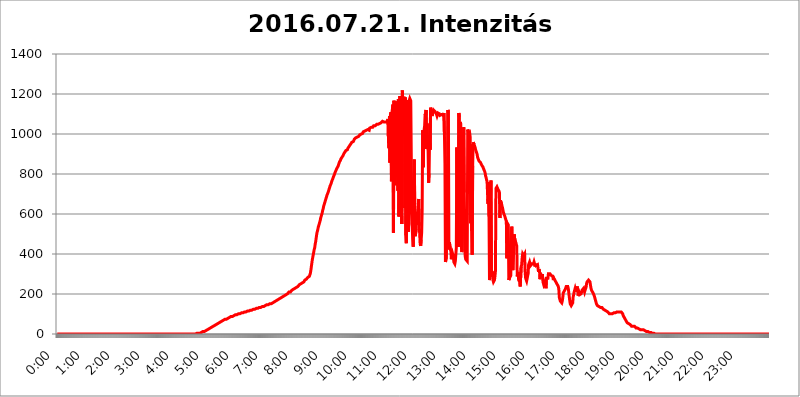
| Category | 2016.07.21. Intenzitás [W/m^2] |
|---|---|
| 0.0 | 0 |
| 0.0006944444444444445 | 0 |
| 0.001388888888888889 | 0 |
| 0.0020833333333333333 | 0 |
| 0.002777777777777778 | 0 |
| 0.003472222222222222 | 0 |
| 0.004166666666666667 | 0 |
| 0.004861111111111111 | 0 |
| 0.005555555555555556 | 0 |
| 0.0062499999999999995 | 0 |
| 0.006944444444444444 | 0 |
| 0.007638888888888889 | 0 |
| 0.008333333333333333 | 0 |
| 0.009027777777777779 | 0 |
| 0.009722222222222222 | 0 |
| 0.010416666666666666 | 0 |
| 0.011111111111111112 | 0 |
| 0.011805555555555555 | 0 |
| 0.012499999999999999 | 0 |
| 0.013194444444444444 | 0 |
| 0.013888888888888888 | 0 |
| 0.014583333333333332 | 0 |
| 0.015277777777777777 | 0 |
| 0.015972222222222224 | 0 |
| 0.016666666666666666 | 0 |
| 0.017361111111111112 | 0 |
| 0.018055555555555557 | 0 |
| 0.01875 | 0 |
| 0.019444444444444445 | 0 |
| 0.02013888888888889 | 0 |
| 0.020833333333333332 | 0 |
| 0.02152777777777778 | 0 |
| 0.022222222222222223 | 0 |
| 0.02291666666666667 | 0 |
| 0.02361111111111111 | 0 |
| 0.024305555555555556 | 0 |
| 0.024999999999999998 | 0 |
| 0.025694444444444447 | 0 |
| 0.02638888888888889 | 0 |
| 0.027083333333333334 | 0 |
| 0.027777777777777776 | 0 |
| 0.02847222222222222 | 0 |
| 0.029166666666666664 | 0 |
| 0.029861111111111113 | 0 |
| 0.030555555555555555 | 0 |
| 0.03125 | 0 |
| 0.03194444444444445 | 0 |
| 0.03263888888888889 | 0 |
| 0.03333333333333333 | 0 |
| 0.034027777777777775 | 0 |
| 0.034722222222222224 | 0 |
| 0.035416666666666666 | 0 |
| 0.036111111111111115 | 0 |
| 0.03680555555555556 | 0 |
| 0.0375 | 0 |
| 0.03819444444444444 | 0 |
| 0.03888888888888889 | 0 |
| 0.03958333333333333 | 0 |
| 0.04027777777777778 | 0 |
| 0.04097222222222222 | 0 |
| 0.041666666666666664 | 0 |
| 0.042361111111111106 | 0 |
| 0.04305555555555556 | 0 |
| 0.043750000000000004 | 0 |
| 0.044444444444444446 | 0 |
| 0.04513888888888889 | 0 |
| 0.04583333333333334 | 0 |
| 0.04652777777777778 | 0 |
| 0.04722222222222222 | 0 |
| 0.04791666666666666 | 0 |
| 0.04861111111111111 | 0 |
| 0.049305555555555554 | 0 |
| 0.049999999999999996 | 0 |
| 0.05069444444444445 | 0 |
| 0.051388888888888894 | 0 |
| 0.052083333333333336 | 0 |
| 0.05277777777777778 | 0 |
| 0.05347222222222222 | 0 |
| 0.05416666666666667 | 0 |
| 0.05486111111111111 | 0 |
| 0.05555555555555555 | 0 |
| 0.05625 | 0 |
| 0.05694444444444444 | 0 |
| 0.057638888888888885 | 0 |
| 0.05833333333333333 | 0 |
| 0.05902777777777778 | 0 |
| 0.059722222222222225 | 0 |
| 0.06041666666666667 | 0 |
| 0.061111111111111116 | 0 |
| 0.06180555555555556 | 0 |
| 0.0625 | 0 |
| 0.06319444444444444 | 0 |
| 0.06388888888888888 | 0 |
| 0.06458333333333334 | 0 |
| 0.06527777777777778 | 0 |
| 0.06597222222222222 | 0 |
| 0.06666666666666667 | 0 |
| 0.06736111111111111 | 0 |
| 0.06805555555555555 | 0 |
| 0.06874999999999999 | 0 |
| 0.06944444444444443 | 0 |
| 0.07013888888888889 | 0 |
| 0.07083333333333333 | 0 |
| 0.07152777777777779 | 0 |
| 0.07222222222222223 | 0 |
| 0.07291666666666667 | 0 |
| 0.07361111111111111 | 0 |
| 0.07430555555555556 | 0 |
| 0.075 | 0 |
| 0.07569444444444444 | 0 |
| 0.0763888888888889 | 0 |
| 0.07708333333333334 | 0 |
| 0.07777777777777778 | 0 |
| 0.07847222222222222 | 0 |
| 0.07916666666666666 | 0 |
| 0.0798611111111111 | 0 |
| 0.08055555555555556 | 0 |
| 0.08125 | 0 |
| 0.08194444444444444 | 0 |
| 0.08263888888888889 | 0 |
| 0.08333333333333333 | 0 |
| 0.08402777777777777 | 0 |
| 0.08472222222222221 | 0 |
| 0.08541666666666665 | 0 |
| 0.08611111111111112 | 0 |
| 0.08680555555555557 | 0 |
| 0.08750000000000001 | 0 |
| 0.08819444444444445 | 0 |
| 0.08888888888888889 | 0 |
| 0.08958333333333333 | 0 |
| 0.09027777777777778 | 0 |
| 0.09097222222222222 | 0 |
| 0.09166666666666667 | 0 |
| 0.09236111111111112 | 0 |
| 0.09305555555555556 | 0 |
| 0.09375 | 0 |
| 0.09444444444444444 | 0 |
| 0.09513888888888888 | 0 |
| 0.09583333333333333 | 0 |
| 0.09652777777777777 | 0 |
| 0.09722222222222222 | 0 |
| 0.09791666666666667 | 0 |
| 0.09861111111111111 | 0 |
| 0.09930555555555555 | 0 |
| 0.09999999999999999 | 0 |
| 0.10069444444444443 | 0 |
| 0.1013888888888889 | 0 |
| 0.10208333333333335 | 0 |
| 0.10277777777777779 | 0 |
| 0.10347222222222223 | 0 |
| 0.10416666666666667 | 0 |
| 0.10486111111111111 | 0 |
| 0.10555555555555556 | 0 |
| 0.10625 | 0 |
| 0.10694444444444444 | 0 |
| 0.1076388888888889 | 0 |
| 0.10833333333333334 | 0 |
| 0.10902777777777778 | 0 |
| 0.10972222222222222 | 0 |
| 0.1111111111111111 | 0 |
| 0.11180555555555556 | 0 |
| 0.11180555555555556 | 0 |
| 0.1125 | 0 |
| 0.11319444444444444 | 0 |
| 0.11388888888888889 | 0 |
| 0.11458333333333333 | 0 |
| 0.11527777777777777 | 0 |
| 0.11597222222222221 | 0 |
| 0.11666666666666665 | 0 |
| 0.1173611111111111 | 0 |
| 0.11805555555555557 | 0 |
| 0.11944444444444445 | 0 |
| 0.12013888888888889 | 0 |
| 0.12083333333333333 | 0 |
| 0.12152777777777778 | 0 |
| 0.12222222222222223 | 0 |
| 0.12291666666666667 | 0 |
| 0.12291666666666667 | 0 |
| 0.12361111111111112 | 0 |
| 0.12430555555555556 | 0 |
| 0.125 | 0 |
| 0.12569444444444444 | 0 |
| 0.12638888888888888 | 0 |
| 0.12708333333333333 | 0 |
| 0.16875 | 0 |
| 0.12847222222222224 | 0 |
| 0.12916666666666668 | 0 |
| 0.12986111111111112 | 0 |
| 0.13055555555555556 | 0 |
| 0.13125 | 0 |
| 0.13194444444444445 | 0 |
| 0.1326388888888889 | 0 |
| 0.13333333333333333 | 0 |
| 0.13402777777777777 | 0 |
| 0.13402777777777777 | 0 |
| 0.13472222222222222 | 0 |
| 0.13541666666666666 | 0 |
| 0.1361111111111111 | 0 |
| 0.13749999999999998 | 0 |
| 0.13819444444444443 | 0 |
| 0.1388888888888889 | 0 |
| 0.13958333333333334 | 0 |
| 0.14027777777777778 | 0 |
| 0.14097222222222222 | 0 |
| 0.14166666666666666 | 0 |
| 0.1423611111111111 | 0 |
| 0.14305555555555557 | 0 |
| 0.14375000000000002 | 0 |
| 0.14444444444444446 | 0 |
| 0.1451388888888889 | 0 |
| 0.1451388888888889 | 0 |
| 0.14652777777777778 | 0 |
| 0.14722222222222223 | 0 |
| 0.14791666666666667 | 0 |
| 0.1486111111111111 | 0 |
| 0.14930555555555555 | 0 |
| 0.15 | 0 |
| 0.15069444444444444 | 0 |
| 0.15138888888888888 | 0 |
| 0.15208333333333332 | 0 |
| 0.15277777777777776 | 0 |
| 0.15347222222222223 | 0 |
| 0.15416666666666667 | 0 |
| 0.15486111111111112 | 0 |
| 0.15555555555555556 | 0 |
| 0.15625 | 0 |
| 0.15694444444444444 | 0 |
| 0.15763888888888888 | 0 |
| 0.15833333333333333 | 0 |
| 0.15902777777777777 | 0 |
| 0.15972222222222224 | 0 |
| 0.16041666666666668 | 0 |
| 0.16111111111111112 | 0 |
| 0.16180555555555556 | 0 |
| 0.1625 | 0 |
| 0.16319444444444445 | 0 |
| 0.1638888888888889 | 0 |
| 0.16458333333333333 | 0 |
| 0.16527777777777777 | 0 |
| 0.16597222222222222 | 0 |
| 0.16666666666666666 | 0 |
| 0.1673611111111111 | 0 |
| 0.16805555555555554 | 0 |
| 0.16874999999999998 | 0 |
| 0.16944444444444443 | 0 |
| 0.17013888888888887 | 0 |
| 0.1708333333333333 | 0 |
| 0.17152777777777775 | 0 |
| 0.17222222222222225 | 0 |
| 0.1729166666666667 | 0 |
| 0.17361111111111113 | 0 |
| 0.17430555555555557 | 0 |
| 0.17500000000000002 | 0 |
| 0.17569444444444446 | 0 |
| 0.1763888888888889 | 0 |
| 0.17708333333333334 | 0 |
| 0.17777777777777778 | 0 |
| 0.17847222222222223 | 0 |
| 0.17916666666666667 | 0 |
| 0.1798611111111111 | 0 |
| 0.18055555555555555 | 0 |
| 0.18125 | 0 |
| 0.18194444444444444 | 0 |
| 0.1826388888888889 | 0 |
| 0.18333333333333335 | 0 |
| 0.1840277777777778 | 0 |
| 0.18472222222222223 | 0 |
| 0.18541666666666667 | 0 |
| 0.18611111111111112 | 0 |
| 0.18680555555555556 | 0 |
| 0.1875 | 0 |
| 0.18819444444444444 | 0 |
| 0.18888888888888888 | 0 |
| 0.18958333333333333 | 0 |
| 0.19027777777777777 | 0 |
| 0.1909722222222222 | 0 |
| 0.19166666666666665 | 0 |
| 0.19236111111111112 | 0 |
| 0.19305555555555554 | 0 |
| 0.19375 | 0 |
| 0.19444444444444445 | 3.525 |
| 0.1951388888888889 | 3.525 |
| 0.19583333333333333 | 3.525 |
| 0.19652777777777777 | 3.525 |
| 0.19722222222222222 | 3.525 |
| 0.19791666666666666 | 3.525 |
| 0.1986111111111111 | 3.525 |
| 0.19930555555555554 | 3.525 |
| 0.19999999999999998 | 3.525 |
| 0.20069444444444443 | 7.887 |
| 0.20138888888888887 | 7.887 |
| 0.2020833333333333 | 7.887 |
| 0.2027777777777778 | 7.887 |
| 0.2034722222222222 | 12.257 |
| 0.2041666666666667 | 12.257 |
| 0.20486111111111113 | 12.257 |
| 0.20555555555555557 | 12.257 |
| 0.20625000000000002 | 12.257 |
| 0.20694444444444446 | 16.636 |
| 0.2076388888888889 | 16.636 |
| 0.20833333333333334 | 16.636 |
| 0.20902777777777778 | 16.636 |
| 0.20972222222222223 | 21.024 |
| 0.21041666666666667 | 21.024 |
| 0.2111111111111111 | 21.024 |
| 0.21180555555555555 | 25.419 |
| 0.2125 | 25.419 |
| 0.21319444444444444 | 25.419 |
| 0.2138888888888889 | 29.823 |
| 0.21458333333333335 | 29.823 |
| 0.2152777777777778 | 29.823 |
| 0.21597222222222223 | 34.234 |
| 0.21666666666666667 | 34.234 |
| 0.21736111111111112 | 38.653 |
| 0.21805555555555556 | 38.653 |
| 0.21875 | 38.653 |
| 0.21944444444444444 | 43.079 |
| 0.22013888888888888 | 43.079 |
| 0.22083333333333333 | 43.079 |
| 0.22152777777777777 | 47.511 |
| 0.2222222222222222 | 47.511 |
| 0.22291666666666665 | 47.511 |
| 0.2236111111111111 | 47.511 |
| 0.22430555555555556 | 51.951 |
| 0.225 | 51.951 |
| 0.22569444444444445 | 51.951 |
| 0.2263888888888889 | 56.398 |
| 0.22708333333333333 | 56.398 |
| 0.22777777777777777 | 56.398 |
| 0.22847222222222222 | 56.398 |
| 0.22916666666666666 | 60.85 |
| 0.2298611111111111 | 60.85 |
| 0.23055555555555554 | 65.31 |
| 0.23124999999999998 | 65.31 |
| 0.23194444444444443 | 65.31 |
| 0.23263888888888887 | 65.31 |
| 0.2333333333333333 | 69.775 |
| 0.2340277777777778 | 69.775 |
| 0.2347222222222222 | 74.246 |
| 0.2354166666666667 | 74.246 |
| 0.23611111111111113 | 74.246 |
| 0.23680555555555557 | 74.246 |
| 0.23750000000000002 | 74.246 |
| 0.23819444444444446 | 78.722 |
| 0.2388888888888889 | 78.722 |
| 0.23958333333333334 | 78.722 |
| 0.24027777777777778 | 78.722 |
| 0.24097222222222223 | 83.205 |
| 0.24166666666666667 | 83.205 |
| 0.2423611111111111 | 83.205 |
| 0.24305555555555555 | 83.205 |
| 0.24375 | 87.692 |
| 0.24444444444444446 | 87.692 |
| 0.24513888888888888 | 87.692 |
| 0.24583333333333335 | 87.692 |
| 0.2465277777777778 | 92.184 |
| 0.24722222222222223 | 92.184 |
| 0.24791666666666667 | 92.184 |
| 0.24861111111111112 | 92.184 |
| 0.24930555555555556 | 92.184 |
| 0.25 | 96.682 |
| 0.25069444444444444 | 96.682 |
| 0.2513888888888889 | 96.682 |
| 0.2520833333333333 | 96.682 |
| 0.25277777777777777 | 96.682 |
| 0.2534722222222222 | 96.682 |
| 0.25416666666666665 | 101.184 |
| 0.2548611111111111 | 101.184 |
| 0.2555555555555556 | 101.184 |
| 0.25625000000000003 | 101.184 |
| 0.2569444444444445 | 101.184 |
| 0.2576388888888889 | 105.69 |
| 0.25833333333333336 | 105.69 |
| 0.2590277777777778 | 105.69 |
| 0.25972222222222224 | 105.69 |
| 0.2604166666666667 | 105.69 |
| 0.2611111111111111 | 110.201 |
| 0.26180555555555557 | 110.201 |
| 0.2625 | 110.201 |
| 0.26319444444444445 | 110.201 |
| 0.2638888888888889 | 110.201 |
| 0.26458333333333334 | 110.201 |
| 0.2652777777777778 | 110.201 |
| 0.2659722222222222 | 114.716 |
| 0.26666666666666666 | 114.716 |
| 0.2673611111111111 | 114.716 |
| 0.26805555555555555 | 114.716 |
| 0.26875 | 114.716 |
| 0.26944444444444443 | 114.716 |
| 0.2701388888888889 | 119.235 |
| 0.2708333333333333 | 119.235 |
| 0.27152777777777776 | 119.235 |
| 0.2722222222222222 | 119.235 |
| 0.27291666666666664 | 119.235 |
| 0.2736111111111111 | 119.235 |
| 0.2743055555555555 | 119.235 |
| 0.27499999999999997 | 123.758 |
| 0.27569444444444446 | 123.758 |
| 0.27638888888888885 | 123.758 |
| 0.27708333333333335 | 123.758 |
| 0.2777777777777778 | 123.758 |
| 0.27847222222222223 | 128.284 |
| 0.2791666666666667 | 128.284 |
| 0.2798611111111111 | 128.284 |
| 0.28055555555555556 | 128.284 |
| 0.28125 | 128.284 |
| 0.28194444444444444 | 132.814 |
| 0.2826388888888889 | 132.814 |
| 0.2833333333333333 | 132.814 |
| 0.28402777777777777 | 132.814 |
| 0.2847222222222222 | 132.814 |
| 0.28541666666666665 | 132.814 |
| 0.28611111111111115 | 132.814 |
| 0.28680555555555554 | 137.347 |
| 0.28750000000000003 | 137.347 |
| 0.2881944444444445 | 137.347 |
| 0.2888888888888889 | 137.347 |
| 0.28958333333333336 | 137.347 |
| 0.2902777777777778 | 141.884 |
| 0.29097222222222224 | 141.884 |
| 0.2916666666666667 | 141.884 |
| 0.2923611111111111 | 141.884 |
| 0.29305555555555557 | 141.884 |
| 0.29375 | 146.423 |
| 0.29444444444444445 | 146.423 |
| 0.2951388888888889 | 146.423 |
| 0.29583333333333334 | 146.423 |
| 0.2965277777777778 | 146.423 |
| 0.2972222222222222 | 146.423 |
| 0.29791666666666666 | 150.964 |
| 0.2986111111111111 | 150.964 |
| 0.29930555555555555 | 150.964 |
| 0.3 | 150.964 |
| 0.30069444444444443 | 150.964 |
| 0.3013888888888889 | 155.509 |
| 0.3020833333333333 | 155.509 |
| 0.30277777777777776 | 155.509 |
| 0.3034722222222222 | 160.056 |
| 0.30416666666666664 | 160.056 |
| 0.3048611111111111 | 160.056 |
| 0.3055555555555555 | 164.605 |
| 0.30624999999999997 | 164.605 |
| 0.3069444444444444 | 164.605 |
| 0.3076388888888889 | 169.156 |
| 0.30833333333333335 | 169.156 |
| 0.3090277777777778 | 169.156 |
| 0.30972222222222223 | 173.709 |
| 0.3104166666666667 | 173.709 |
| 0.3111111111111111 | 178.264 |
| 0.31180555555555556 | 178.264 |
| 0.3125 | 178.264 |
| 0.31319444444444444 | 182.82 |
| 0.3138888888888889 | 182.82 |
| 0.3145833333333333 | 182.82 |
| 0.31527777777777777 | 182.82 |
| 0.3159722222222222 | 187.378 |
| 0.31666666666666665 | 187.378 |
| 0.31736111111111115 | 191.937 |
| 0.31805555555555554 | 191.937 |
| 0.31875000000000003 | 191.937 |
| 0.3194444444444445 | 191.937 |
| 0.3201388888888889 | 196.497 |
| 0.32083333333333336 | 196.497 |
| 0.3215277777777778 | 201.058 |
| 0.32222222222222224 | 201.058 |
| 0.3229166666666667 | 201.058 |
| 0.3236111111111111 | 205.62 |
| 0.32430555555555557 | 205.62 |
| 0.325 | 210.182 |
| 0.32569444444444445 | 210.182 |
| 0.3263888888888889 | 210.182 |
| 0.32708333333333334 | 210.182 |
| 0.3277777777777778 | 214.746 |
| 0.3284722222222222 | 214.746 |
| 0.32916666666666666 | 219.309 |
| 0.3298611111111111 | 219.309 |
| 0.33055555555555555 | 219.309 |
| 0.33125 | 223.873 |
| 0.33194444444444443 | 223.873 |
| 0.3326388888888889 | 228.436 |
| 0.3333333333333333 | 228.436 |
| 0.3340277777777778 | 233 |
| 0.3347222222222222 | 233 |
| 0.3354166666666667 | 233 |
| 0.3361111111111111 | 237.564 |
| 0.3368055555555556 | 237.564 |
| 0.33749999999999997 | 237.564 |
| 0.33819444444444446 | 242.127 |
| 0.33888888888888885 | 242.127 |
| 0.33958333333333335 | 246.689 |
| 0.34027777777777773 | 246.689 |
| 0.34097222222222223 | 251.251 |
| 0.3416666666666666 | 251.251 |
| 0.3423611111111111 | 251.251 |
| 0.3430555555555555 | 255.813 |
| 0.34375 | 255.813 |
| 0.3444444444444445 | 260.373 |
| 0.3451388888888889 | 260.373 |
| 0.3458333333333334 | 260.373 |
| 0.34652777777777777 | 264.932 |
| 0.34722222222222227 | 269.49 |
| 0.34791666666666665 | 269.49 |
| 0.34861111111111115 | 274.047 |
| 0.34930555555555554 | 274.047 |
| 0.35000000000000003 | 278.603 |
| 0.3506944444444444 | 278.603 |
| 0.3513888888888889 | 283.156 |
| 0.3520833333333333 | 287.709 |
| 0.3527777777777778 | 287.709 |
| 0.3534722222222222 | 287.709 |
| 0.3541666666666667 | 292.259 |
| 0.3548611111111111 | 301.354 |
| 0.35555555555555557 | 314.98 |
| 0.35625 | 333.113 |
| 0.35694444444444445 | 351.198 |
| 0.3576388888888889 | 369.23 |
| 0.35833333333333334 | 382.715 |
| 0.3590277777777778 | 396.164 |
| 0.3597222222222222 | 409.574 |
| 0.36041666666666666 | 422.943 |
| 0.3611111111111111 | 431.833 |
| 0.36180555555555555 | 449.551 |
| 0.3625 | 462.786 |
| 0.36319444444444443 | 480.356 |
| 0.3638888888888889 | 497.836 |
| 0.3645833333333333 | 510.885 |
| 0.3652777777777778 | 519.555 |
| 0.3659722222222222 | 532.513 |
| 0.3666666666666667 | 541.121 |
| 0.3673611111111111 | 549.704 |
| 0.3680555555555556 | 558.261 |
| 0.36874999999999997 | 566.793 |
| 0.36944444444444446 | 579.542 |
| 0.37013888888888885 | 588.009 |
| 0.37083333333333335 | 596.45 |
| 0.37152777777777773 | 604.864 |
| 0.37222222222222223 | 617.436 |
| 0.3729166666666666 | 625.784 |
| 0.3736111111111111 | 638.256 |
| 0.3743055555555555 | 646.537 |
| 0.375 | 654.791 |
| 0.3756944444444445 | 663.019 |
| 0.3763888888888889 | 671.22 |
| 0.3770833333333334 | 679.395 |
| 0.37777777777777777 | 687.544 |
| 0.37847222222222227 | 695.666 |
| 0.37916666666666665 | 699.717 |
| 0.37986111111111115 | 707.8 |
| 0.38055555555555554 | 715.858 |
| 0.38125000000000003 | 723.889 |
| 0.3819444444444444 | 731.896 |
| 0.3826388888888889 | 739.877 |
| 0.3833333333333333 | 743.859 |
| 0.3840277777777778 | 751.803 |
| 0.3847222222222222 | 759.723 |
| 0.3854166666666667 | 767.62 |
| 0.3861111111111111 | 771.559 |
| 0.38680555555555557 | 779.42 |
| 0.3875 | 787.258 |
| 0.38819444444444445 | 791.169 |
| 0.3888888888888889 | 798.974 |
| 0.38958333333333334 | 806.757 |
| 0.3902777777777778 | 810.641 |
| 0.3909722222222222 | 818.392 |
| 0.39166666666666666 | 822.26 |
| 0.3923611111111111 | 829.981 |
| 0.39305555555555555 | 833.834 |
| 0.39375 | 837.682 |
| 0.39444444444444443 | 845.365 |
| 0.3951388888888889 | 853.029 |
| 0.3958333333333333 | 860.676 |
| 0.3965277777777778 | 864.493 |
| 0.3972222222222222 | 868.305 |
| 0.3979166666666667 | 875.918 |
| 0.3986111111111111 | 879.719 |
| 0.3993055555555556 | 883.516 |
| 0.39999999999999997 | 887.309 |
| 0.40069444444444446 | 891.099 |
| 0.40138888888888885 | 894.885 |
| 0.40208333333333335 | 902.447 |
| 0.40277777777777773 | 906.223 |
| 0.40347222222222223 | 909.996 |
| 0.4041666666666666 | 913.766 |
| 0.4048611111111111 | 917.534 |
| 0.4055555555555555 | 917.534 |
| 0.40625 | 917.534 |
| 0.4069444444444445 | 921.298 |
| 0.4076388888888889 | 928.819 |
| 0.4083333333333334 | 932.576 |
| 0.40902777777777777 | 936.33 |
| 0.40972222222222227 | 940.082 |
| 0.41041666666666665 | 943.832 |
| 0.41111111111111115 | 947.58 |
| 0.41180555555555554 | 951.327 |
| 0.41250000000000003 | 955.071 |
| 0.4131944444444444 | 958.814 |
| 0.4138888888888889 | 962.555 |
| 0.4145833333333333 | 962.555 |
| 0.4152777777777778 | 962.555 |
| 0.4159722222222222 | 966.295 |
| 0.4166666666666667 | 973.772 |
| 0.4173611111111111 | 973.772 |
| 0.41805555555555557 | 977.508 |
| 0.41875 | 981.244 |
| 0.41944444444444445 | 981.244 |
| 0.4201388888888889 | 981.244 |
| 0.42083333333333334 | 984.98 |
| 0.4215277777777778 | 984.98 |
| 0.4222222222222222 | 988.714 |
| 0.42291666666666666 | 988.714 |
| 0.4236111111111111 | 988.714 |
| 0.42430555555555555 | 996.182 |
| 0.425 | 996.182 |
| 0.42569444444444443 | 999.916 |
| 0.4263888888888889 | 999.916 |
| 0.4270833333333333 | 999.916 |
| 0.4277777777777778 | 1003.65 |
| 0.4284722222222222 | 1003.65 |
| 0.4291666666666667 | 1011.118 |
| 0.4298611111111111 | 1014.852 |
| 0.4305555555555556 | 1011.118 |
| 0.43124999999999997 | 1014.852 |
| 0.43194444444444446 | 1014.852 |
| 0.43263888888888885 | 1018.587 |
| 0.43333333333333335 | 1018.587 |
| 0.43402777777777773 | 1018.587 |
| 0.43472222222222223 | 1022.323 |
| 0.4354166666666666 | 1022.323 |
| 0.4361111111111111 | 1026.06 |
| 0.4368055555555555 | 1026.06 |
| 0.4375 | 1018.587 |
| 0.4381944444444445 | 1029.798 |
| 0.4388888888888889 | 1026.06 |
| 0.4395833333333334 | 1029.798 |
| 0.44027777777777777 | 1033.537 |
| 0.44097222222222227 | 1033.537 |
| 0.44166666666666665 | 1033.537 |
| 0.44236111111111115 | 1033.537 |
| 0.44305555555555554 | 1033.537 |
| 0.44375000000000003 | 1041.019 |
| 0.4444444444444444 | 1041.019 |
| 0.4451388888888889 | 1041.019 |
| 0.4458333333333333 | 1041.019 |
| 0.4465277777777778 | 1041.019 |
| 0.4472222222222222 | 1044.762 |
| 0.4479166666666667 | 1048.508 |
| 0.4486111111111111 | 1044.762 |
| 0.44930555555555557 | 1044.762 |
| 0.45 | 1048.508 |
| 0.45069444444444445 | 1048.508 |
| 0.4513888888888889 | 1052.255 |
| 0.45208333333333334 | 1052.255 |
| 0.4527777777777778 | 1052.255 |
| 0.4534722222222222 | 1056.004 |
| 0.45416666666666666 | 1056.004 |
| 0.4548611111111111 | 1056.004 |
| 0.45555555555555555 | 1056.004 |
| 0.45625 | 1063.51 |
| 0.45694444444444443 | 1059.756 |
| 0.4576388888888889 | 1059.756 |
| 0.4583333333333333 | 1059.756 |
| 0.4590277777777778 | 1059.756 |
| 0.4597222222222222 | 1056.004 |
| 0.4604166666666667 | 1059.756 |
| 0.4611111111111111 | 1059.756 |
| 0.4618055555555556 | 1059.756 |
| 0.46249999999999997 | 1059.756 |
| 0.46319444444444446 | 1063.51 |
| 0.46388888888888885 | 1074.789 |
| 0.46458333333333335 | 962.555 |
| 0.46527777777777773 | 928.819 |
| 0.46597222222222223 | 1089.873 |
| 0.4666666666666666 | 856.855 |
| 0.4673611111111111 | 1097.437 |
| 0.4680555555555555 | 1108.816 |
| 0.46875 | 763.674 |
| 0.4694444444444445 | 1108.816 |
| 0.4701388888888889 | 1108.816 |
| 0.4708333333333334 | 1147.086 |
| 0.47152777777777777 | 506.542 |
| 0.47222222222222227 | 1166.46 |
| 0.47291666666666665 | 1143.232 |
| 0.47361111111111115 | 791.169 |
| 0.47430555555555554 | 743.859 |
| 0.47500000000000003 | 1162.571 |
| 0.4756944444444444 | 1154.814 |
| 0.4763888888888889 | 1147.086 |
| 0.4770833333333333 | 1147.086 |
| 0.4777777777777778 | 715.858 |
| 0.4784722222222222 | 1174.263 |
| 0.4791666666666667 | 588.009 |
| 0.4798611111111111 | 719.877 |
| 0.48055555555555557 | 1189.969 |
| 0.48125 | 715.858 |
| 0.48194444444444445 | 600.661 |
| 0.4826388888888889 | 638.256 |
| 0.48333333333333334 | 549.704 |
| 0.4840277777777778 | 1217.812 |
| 0.4847222222222222 | 1101.226 |
| 0.48541666666666666 | 1143.232 |
| 0.4861111111111111 | 1186.03 |
| 0.48680555555555555 | 1174.263 |
| 0.4875 | 629.948 |
| 0.48819444444444443 | 1182.099 |
| 0.4888888888888889 | 493.475 |
| 0.4895833333333333 | 453.968 |
| 0.4902777777777778 | 1170.358 |
| 0.4909722222222222 | 1174.263 |
| 0.4916666666666667 | 966.295 |
| 0.4923611111111111 | 510.885 |
| 0.4930555555555556 | 558.261 |
| 0.49374999999999997 | 1170.358 |
| 0.49444444444444446 | 1178.177 |
| 0.49513888888888885 | 1178.177 |
| 0.49583333333333335 | 1166.46 |
| 0.49652777777777773 | 1170.358 |
| 0.49722222222222223 | 617.436 |
| 0.4979166666666666 | 528.2 |
| 0.4986111111111111 | 471.582 |
| 0.4993055555555555 | 436.27 |
| 0.5 | 703.762 |
| 0.5006944444444444 | 872.114 |
| 0.5013888888888889 | 650.667 |
| 0.5020833333333333 | 489.108 |
| 0.5027777777777778 | 493.475 |
| 0.5034722222222222 | 523.88 |
| 0.5041666666666667 | 592.233 |
| 0.5048611111111111 | 592.233 |
| 0.5055555555555555 | 613.252 |
| 0.50625 | 613.252 |
| 0.5069444444444444 | 675.311 |
| 0.5076388888888889 | 541.121 |
| 0.5083333333333333 | 502.192 |
| 0.5090277777777777 | 449.551 |
| 0.5097222222222222 | 440.702 |
| 0.5104166666666666 | 471.582 |
| 0.5111111111111112 | 506.542 |
| 0.5118055555555555 | 621.613 |
| 0.5125000000000001 | 1018.587 |
| 0.5131944444444444 | 833.834 |
| 0.513888888888889 | 940.082 |
| 0.5145833333333333 | 1022.323 |
| 0.5152777777777778 | 1041.019 |
| 0.5159722222222222 | 1101.226 |
| 0.5166666666666667 | 1093.653 |
| 0.517361111111111 | 1120.238 |
| 0.5180555555555556 | 925.06 |
| 0.5187499999999999 | 1052.255 |
| 0.5194444444444445 | 932.576 |
| 0.5201388888888888 | 917.534 |
| 0.5208333333333334 | 755.766 |
| 0.5215277777777778 | 802.868 |
| 0.5222222222222223 | 996.182 |
| 0.5229166666666667 | 921.298 |
| 0.5236111111111111 | 1131.708 |
| 0.5243055555555556 | 1131.708 |
| 0.525 | 1131.708 |
| 0.5256944444444445 | 1089.873 |
| 0.5263888888888889 | 1086.097 |
| 0.5270833333333333 | 1112.618 |
| 0.5277777777777778 | 1120.238 |
| 0.5284722222222222 | 1116.426 |
| 0.5291666666666667 | 1116.426 |
| 0.5298611111111111 | 1112.618 |
| 0.5305555555555556 | 1108.816 |
| 0.53125 | 1108.816 |
| 0.5319444444444444 | 1097.437 |
| 0.5326388888888889 | 1089.873 |
| 0.5333333333333333 | 1093.653 |
| 0.5340277777777778 | 1105.019 |
| 0.5347222222222222 | 1108.816 |
| 0.5354166666666667 | 1105.019 |
| 0.5361111111111111 | 1101.226 |
| 0.5368055555555555 | 1093.653 |
| 0.5375 | 1093.653 |
| 0.5381944444444444 | 1093.653 |
| 0.5388888888888889 | 1097.437 |
| 0.5395833333333333 | 1093.653 |
| 0.5402777777777777 | 1093.653 |
| 0.5409722222222222 | 1093.653 |
| 0.5416666666666666 | 1093.653 |
| 0.5423611111111112 | 1105.019 |
| 0.5430555555555555 | 996.182 |
| 0.5437500000000001 | 853.029 |
| 0.5444444444444444 | 360.221 |
| 0.545138888888889 | 369.23 |
| 0.5458333333333333 | 378.224 |
| 0.5465277777777778 | 849.199 |
| 0.5472222222222222 | 510.885 |
| 0.5479166666666667 | 1120.238 |
| 0.548611111111111 | 1112.618 |
| 0.5493055555555556 | 422.943 |
| 0.5499999999999999 | 458.38 |
| 0.5506944444444445 | 453.968 |
| 0.5513888888888888 | 422.943 |
| 0.5520833333333334 | 414.035 |
| 0.5527777777777778 | 373.729 |
| 0.5534722222222223 | 396.164 |
| 0.5541666666666667 | 405.108 |
| 0.5548611111111111 | 405.108 |
| 0.5555555555555556 | 387.202 |
| 0.55625 | 360.221 |
| 0.5569444444444445 | 355.712 |
| 0.5576388888888889 | 351.198 |
| 0.5583333333333333 | 364.728 |
| 0.5590277777777778 | 369.23 |
| 0.5597222222222222 | 431.833 |
| 0.5604166666666667 | 932.576 |
| 0.5611111111111111 | 462.786 |
| 0.5618055555555556 | 558.261 |
| 0.5625 | 436.27 |
| 0.5631944444444444 | 1105.019 |
| 0.5638888888888889 | 1086.097 |
| 0.5645833333333333 | 613.252 |
| 0.5652777777777778 | 1059.756 |
| 0.5659722222222222 | 1048.508 |
| 0.5666666666666667 | 445.129 |
| 0.5673611111111111 | 409.574 |
| 0.5680555555555555 | 422.943 |
| 0.56875 | 667.123 |
| 0.5694444444444444 | 958.814 |
| 0.5701388888888889 | 1033.537 |
| 0.5708333333333333 | 707.8 |
| 0.5715277777777777 | 427.39 |
| 0.5722222222222222 | 387.202 |
| 0.5729166666666666 | 373.729 |
| 0.5736111111111112 | 378.224 |
| 0.5743055555555555 | 373.729 |
| 0.5750000000000001 | 364.728 |
| 0.5756944444444444 | 1022.323 |
| 0.576388888888889 | 1014.852 |
| 0.5770833333333333 | 996.182 |
| 0.5777777777777778 | 996.182 |
| 0.5784722222222222 | 1003.65 |
| 0.5791666666666667 | 984.98 |
| 0.579861111111111 | 553.986 |
| 0.5805555555555556 | 947.58 |
| 0.5812499999999999 | 515.223 |
| 0.5819444444444445 | 396.164 |
| 0.5826388888888888 | 841.526 |
| 0.5833333333333334 | 958.814 |
| 0.5840277777777778 | 955.071 |
| 0.5847222222222223 | 947.58 |
| 0.5854166666666667 | 940.082 |
| 0.5861111111111111 | 932.576 |
| 0.5868055555555556 | 921.298 |
| 0.5875 | 913.766 |
| 0.5881944444444445 | 909.996 |
| 0.5888888888888889 | 898.668 |
| 0.5895833333333333 | 883.516 |
| 0.5902777777777778 | 875.918 |
| 0.5909722222222222 | 872.114 |
| 0.5916666666666667 | 864.493 |
| 0.5923611111111111 | 864.493 |
| 0.5930555555555556 | 860.676 |
| 0.59375 | 856.855 |
| 0.5944444444444444 | 853.029 |
| 0.5951388888888889 | 845.365 |
| 0.5958333333333333 | 841.526 |
| 0.5965277777777778 | 845.365 |
| 0.5972222222222222 | 833.834 |
| 0.5979166666666667 | 826.123 |
| 0.5986111111111111 | 822.26 |
| 0.5993055555555555 | 814.519 |
| 0.6 | 806.757 |
| 0.6006944444444444 | 791.169 |
| 0.6013888888888889 | 783.342 |
| 0.6020833333333333 | 771.559 |
| 0.6027777777777777 | 763.674 |
| 0.6034722222222222 | 759.723 |
| 0.6041666666666666 | 650.667 |
| 0.6048611111111112 | 759.723 |
| 0.6055555555555555 | 588.009 |
| 0.6062500000000001 | 269.49 |
| 0.6069444444444444 | 422.943 |
| 0.607638888888889 | 687.544 |
| 0.6083333333333333 | 767.62 |
| 0.6090277777777778 | 296.808 |
| 0.6097222222222222 | 314.98 |
| 0.6104166666666667 | 292.259 |
| 0.611111111111111 | 269.49 |
| 0.6118055555555556 | 260.373 |
| 0.6124999999999999 | 255.813 |
| 0.6131944444444445 | 269.49 |
| 0.6138888888888888 | 287.709 |
| 0.6145833333333334 | 314.98 |
| 0.6152777777777778 | 727.896 |
| 0.6159722222222223 | 731.896 |
| 0.6166666666666667 | 735.89 |
| 0.6173611111111111 | 735.89 |
| 0.6180555555555556 | 723.889 |
| 0.61875 | 723.889 |
| 0.6194444444444445 | 715.858 |
| 0.6201388888888889 | 707.8 |
| 0.6208333333333333 | 579.542 |
| 0.6215277777777778 | 667.123 |
| 0.6222222222222222 | 663.019 |
| 0.6229166666666667 | 654.791 |
| 0.6236111111111111 | 642.4 |
| 0.6243055555555556 | 634.105 |
| 0.625 | 621.613 |
| 0.6256944444444444 | 609.062 |
| 0.6263888888888889 | 600.661 |
| 0.6270833333333333 | 596.45 |
| 0.6277777777777778 | 588.009 |
| 0.6284722222222222 | 583.779 |
| 0.6291666666666667 | 571.049 |
| 0.6298611111111111 | 562.53 |
| 0.6305555555555555 | 378.224 |
| 0.63125 | 553.986 |
| 0.6319444444444444 | 549.704 |
| 0.6326388888888889 | 545.416 |
| 0.6333333333333333 | 269.49 |
| 0.6340277777777777 | 274.047 |
| 0.6347222222222222 | 283.156 |
| 0.6354166666666666 | 287.709 |
| 0.6361111111111112 | 292.259 |
| 0.6368055555555555 | 475.972 |
| 0.6375000000000001 | 536.82 |
| 0.6381944444444444 | 536.82 |
| 0.638888888888889 | 319.517 |
| 0.6395833333333333 | 314.98 |
| 0.6402777777777778 | 319.517 |
| 0.6409722222222222 | 497.836 |
| 0.6416666666666667 | 471.582 |
| 0.642361111111111 | 449.551 |
| 0.6430555555555556 | 458.38 |
| 0.6437499999999999 | 449.551 |
| 0.6444444444444445 | 440.702 |
| 0.6451388888888888 | 287.709 |
| 0.6458333333333334 | 301.354 |
| 0.6465277777777778 | 310.44 |
| 0.6472222222222223 | 269.49 |
| 0.6479166666666667 | 264.932 |
| 0.6486111111111111 | 260.373 |
| 0.6493055555555556 | 237.564 |
| 0.65 | 237.564 |
| 0.6506944444444445 | 337.639 |
| 0.6513888888888889 | 346.682 |
| 0.6520833333333333 | 382.715 |
| 0.6527777777777778 | 400.638 |
| 0.6534722222222222 | 405.108 |
| 0.6541666666666667 | 391.685 |
| 0.6548611111111111 | 391.685 |
| 0.6555555555555556 | 400.638 |
| 0.65625 | 305.898 |
| 0.6569444444444444 | 278.603 |
| 0.6576388888888889 | 274.047 |
| 0.6583333333333333 | 264.932 |
| 0.6590277777777778 | 260.373 |
| 0.6597222222222222 | 260.373 |
| 0.6604166666666667 | 301.354 |
| 0.6611111111111111 | 346.682 |
| 0.6618055555555555 | 342.162 |
| 0.6625 | 360.221 |
| 0.6631944444444444 | 351.198 |
| 0.6638888888888889 | 342.162 |
| 0.6645833333333333 | 337.639 |
| 0.6652777777777777 | 342.162 |
| 0.6659722222222222 | 351.198 |
| 0.6666666666666666 | 351.198 |
| 0.6673611111111111 | 346.682 |
| 0.6680555555555556 | 351.198 |
| 0.6687500000000001 | 360.221 |
| 0.6694444444444444 | 351.198 |
| 0.6701388888888888 | 337.639 |
| 0.6708333333333334 | 351.198 |
| 0.6715277777777778 | 342.162 |
| 0.6722222222222222 | 346.682 |
| 0.6729166666666666 | 342.162 |
| 0.6736111111111112 | 346.682 |
| 0.6743055555555556 | 342.162 |
| 0.6749999999999999 | 310.44 |
| 0.6756944444444444 | 324.052 |
| 0.6763888888888889 | 314.98 |
| 0.6770833333333334 | 274.047 |
| 0.6777777777777777 | 305.898 |
| 0.6784722222222223 | 292.259 |
| 0.6791666666666667 | 296.808 |
| 0.6798611111111111 | 296.808 |
| 0.6805555555555555 | 292.259 |
| 0.68125 | 260.373 |
| 0.6819444444444445 | 251.251 |
| 0.6826388888888889 | 260.373 |
| 0.6833333333333332 | 251.251 |
| 0.6840277777777778 | 251.251 |
| 0.6847222222222222 | 260.373 |
| 0.6854166666666667 | 228.436 |
| 0.686111111111111 | 278.603 |
| 0.6868055555555556 | 283.156 |
| 0.6875 | 278.603 |
| 0.6881944444444444 | 278.603 |
| 0.688888888888889 | 301.354 |
| 0.6895833333333333 | 296.808 |
| 0.6902777777777778 | 296.808 |
| 0.6909722222222222 | 301.354 |
| 0.6916666666666668 | 305.898 |
| 0.6923611111111111 | 301.354 |
| 0.6930555555555555 | 292.259 |
| 0.69375 | 292.259 |
| 0.6944444444444445 | 287.709 |
| 0.6951388888888889 | 287.709 |
| 0.6958333333333333 | 269.49 |
| 0.6965277777777777 | 278.603 |
| 0.6972222222222223 | 274.047 |
| 0.6979166666666666 | 269.49 |
| 0.6986111111111111 | 264.932 |
| 0.6993055555555556 | 260.373 |
| 0.7000000000000001 | 255.813 |
| 0.7006944444444444 | 251.251 |
| 0.7013888888888888 | 251.251 |
| 0.7020833333333334 | 246.689 |
| 0.7027777777777778 | 237.564 |
| 0.7034722222222222 | 223.873 |
| 0.7041666666666666 | 182.82 |
| 0.7048611111111112 | 173.709 |
| 0.7055555555555556 | 164.605 |
| 0.7062499999999999 | 160.056 |
| 0.7069444444444444 | 164.605 |
| 0.7076388888888889 | 155.509 |
| 0.7083333333333334 | 164.605 |
| 0.7090277777777777 | 182.82 |
| 0.7097222222222223 | 205.62 |
| 0.7104166666666667 | 205.62 |
| 0.7111111111111111 | 214.746 |
| 0.7118055555555555 | 219.309 |
| 0.7125 | 223.873 |
| 0.7131944444444445 | 228.436 |
| 0.7138888888888889 | 237.564 |
| 0.7145833333333332 | 242.127 |
| 0.7152777777777778 | 242.127 |
| 0.7159722222222222 | 237.564 |
| 0.7166666666666667 | 228.436 |
| 0.717361111111111 | 210.182 |
| 0.7180555555555556 | 187.378 |
| 0.71875 | 169.156 |
| 0.7194444444444444 | 150.964 |
| 0.720138888888889 | 146.423 |
| 0.7208333333333333 | 141.884 |
| 0.7215277777777778 | 137.347 |
| 0.7222222222222222 | 137.347 |
| 0.7229166666666668 | 155.509 |
| 0.7236111111111111 | 187.378 |
| 0.7243055555555555 | 196.497 |
| 0.725 | 210.182 |
| 0.7256944444444445 | 219.309 |
| 0.7263888888888889 | 228.436 |
| 0.7270833333333333 | 219.309 |
| 0.7277777777777777 | 210.182 |
| 0.7284722222222223 | 214.746 |
| 0.7291666666666666 | 237.564 |
| 0.7298611111111111 | 219.309 |
| 0.7305555555555556 | 191.937 |
| 0.7312500000000001 | 187.378 |
| 0.7319444444444444 | 205.62 |
| 0.7326388888888888 | 196.497 |
| 0.7333333333333334 | 191.937 |
| 0.7340277777777778 | 196.497 |
| 0.7347222222222222 | 201.058 |
| 0.7354166666666666 | 210.182 |
| 0.7361111111111112 | 219.309 |
| 0.7368055555555556 | 223.873 |
| 0.7374999999999999 | 223.873 |
| 0.7381944444444444 | 228.436 |
| 0.7388888888888889 | 219.309 |
| 0.7395833333333334 | 210.182 |
| 0.7402777777777777 | 219.309 |
| 0.7409722222222223 | 223.873 |
| 0.7416666666666667 | 233 |
| 0.7423611111111111 | 251.251 |
| 0.7430555555555555 | 260.373 |
| 0.74375 | 260.373 |
| 0.7444444444444445 | 260.373 |
| 0.7451388888888889 | 269.49 |
| 0.7458333333333332 | 269.49 |
| 0.7465277777777778 | 264.932 |
| 0.7472222222222222 | 260.373 |
| 0.7479166666666667 | 242.127 |
| 0.748611111111111 | 228.436 |
| 0.7493055555555556 | 219.309 |
| 0.75 | 219.309 |
| 0.7506944444444444 | 210.182 |
| 0.751388888888889 | 205.62 |
| 0.7520833333333333 | 201.058 |
| 0.7527777777777778 | 201.058 |
| 0.7534722222222222 | 187.378 |
| 0.7541666666666668 | 182.82 |
| 0.7548611111111111 | 169.156 |
| 0.7555555555555555 | 164.605 |
| 0.75625 | 150.964 |
| 0.7569444444444445 | 146.423 |
| 0.7576388888888889 | 141.884 |
| 0.7583333333333333 | 137.347 |
| 0.7590277777777777 | 137.347 |
| 0.7597222222222223 | 137.347 |
| 0.7604166666666666 | 137.347 |
| 0.7611111111111111 | 132.814 |
| 0.7618055555555556 | 132.814 |
| 0.7625000000000001 | 132.814 |
| 0.7631944444444444 | 132.814 |
| 0.7638888888888888 | 132.814 |
| 0.7645833333333334 | 128.284 |
| 0.7652777777777778 | 128.284 |
| 0.7659722222222222 | 123.758 |
| 0.7666666666666666 | 123.758 |
| 0.7673611111111112 | 119.235 |
| 0.7680555555555556 | 119.235 |
| 0.7687499999999999 | 119.235 |
| 0.7694444444444444 | 114.716 |
| 0.7701388888888889 | 114.716 |
| 0.7708333333333334 | 110.201 |
| 0.7715277777777777 | 110.201 |
| 0.7722222222222223 | 110.201 |
| 0.7729166666666667 | 105.69 |
| 0.7736111111111111 | 105.69 |
| 0.7743055555555555 | 101.184 |
| 0.775 | 101.184 |
| 0.7756944444444445 | 101.184 |
| 0.7763888888888889 | 101.184 |
| 0.7770833333333332 | 101.184 |
| 0.7777777777777778 | 101.184 |
| 0.7784722222222222 | 101.184 |
| 0.7791666666666667 | 101.184 |
| 0.779861111111111 | 105.69 |
| 0.7805555555555556 | 105.69 |
| 0.78125 | 105.69 |
| 0.7819444444444444 | 105.69 |
| 0.782638888888889 | 105.69 |
| 0.7833333333333333 | 105.69 |
| 0.7840277777777778 | 105.69 |
| 0.7847222222222222 | 110.201 |
| 0.7854166666666668 | 110.201 |
| 0.7861111111111111 | 110.201 |
| 0.7868055555555555 | 110.201 |
| 0.7875 | 110.201 |
| 0.7881944444444445 | 110.201 |
| 0.7888888888888889 | 110.201 |
| 0.7895833333333333 | 110.201 |
| 0.7902777777777777 | 114.716 |
| 0.7909722222222223 | 110.201 |
| 0.7916666666666666 | 110.201 |
| 0.7923611111111111 | 105.69 |
| 0.7930555555555556 | 101.184 |
| 0.7937500000000001 | 92.184 |
| 0.7944444444444444 | 87.692 |
| 0.7951388888888888 | 83.205 |
| 0.7958333333333334 | 78.722 |
| 0.7965277777777778 | 74.246 |
| 0.7972222222222222 | 69.775 |
| 0.7979166666666666 | 65.31 |
| 0.7986111111111112 | 60.85 |
| 0.7993055555555556 | 56.398 |
| 0.7999999999999999 | 56.398 |
| 0.8006944444444444 | 51.951 |
| 0.8013888888888889 | 51.951 |
| 0.8020833333333334 | 47.511 |
| 0.8027777777777777 | 47.511 |
| 0.8034722222222223 | 47.511 |
| 0.8041666666666667 | 43.079 |
| 0.8048611111111111 | 43.079 |
| 0.8055555555555555 | 38.653 |
| 0.80625 | 38.653 |
| 0.8069444444444445 | 38.653 |
| 0.8076388888888889 | 38.653 |
| 0.8083333333333332 | 38.653 |
| 0.8090277777777778 | 38.653 |
| 0.8097222222222222 | 38.653 |
| 0.8104166666666667 | 34.234 |
| 0.811111111111111 | 34.234 |
| 0.8118055555555556 | 29.823 |
| 0.8125 | 29.823 |
| 0.8131944444444444 | 29.823 |
| 0.813888888888889 | 29.823 |
| 0.8145833333333333 | 29.823 |
| 0.8152777777777778 | 25.419 |
| 0.8159722222222222 | 25.419 |
| 0.8166666666666668 | 25.419 |
| 0.8173611111111111 | 25.419 |
| 0.8180555555555555 | 21.024 |
| 0.81875 | 21.024 |
| 0.8194444444444445 | 21.024 |
| 0.8201388888888889 | 21.024 |
| 0.8208333333333333 | 21.024 |
| 0.8215277777777777 | 21.024 |
| 0.8222222222222223 | 21.024 |
| 0.8229166666666666 | 16.636 |
| 0.8236111111111111 | 16.636 |
| 0.8243055555555556 | 16.636 |
| 0.8250000000000001 | 12.257 |
| 0.8256944444444444 | 12.257 |
| 0.8263888888888888 | 12.257 |
| 0.8270833333333334 | 12.257 |
| 0.8277777777777778 | 12.257 |
| 0.8284722222222222 | 12.257 |
| 0.8291666666666666 | 12.257 |
| 0.8298611111111112 | 7.887 |
| 0.8305555555555556 | 7.887 |
| 0.8312499999999999 | 7.887 |
| 0.8319444444444444 | 7.887 |
| 0.8326388888888889 | 7.887 |
| 0.8333333333333334 | 7.887 |
| 0.8340277777777777 | 7.887 |
| 0.8347222222222223 | 3.525 |
| 0.8354166666666667 | 3.525 |
| 0.8361111111111111 | 3.525 |
| 0.8368055555555555 | 3.525 |
| 0.8375 | 3.525 |
| 0.8381944444444445 | 3.525 |
| 0.8388888888888889 | 0 |
| 0.8395833333333332 | 0 |
| 0.8402777777777778 | 0 |
| 0.8409722222222222 | 0 |
| 0.8416666666666667 | 0 |
| 0.842361111111111 | 0 |
| 0.8430555555555556 | 0 |
| 0.84375 | 0 |
| 0.8444444444444444 | 0 |
| 0.845138888888889 | 0 |
| 0.8458333333333333 | 0 |
| 0.8465277777777778 | 0 |
| 0.8472222222222222 | 0 |
| 0.8479166666666668 | 0 |
| 0.8486111111111111 | 0 |
| 0.8493055555555555 | 0 |
| 0.85 | 0 |
| 0.8506944444444445 | 0 |
| 0.8513888888888889 | 0 |
| 0.8520833333333333 | 0 |
| 0.8527777777777777 | 0 |
| 0.8534722222222223 | 0 |
| 0.8541666666666666 | 0 |
| 0.8548611111111111 | 0 |
| 0.8555555555555556 | 0 |
| 0.8562500000000001 | 0 |
| 0.8569444444444444 | 0 |
| 0.8576388888888888 | 0 |
| 0.8583333333333334 | 0 |
| 0.8590277777777778 | 0 |
| 0.8597222222222222 | 0 |
| 0.8604166666666666 | 0 |
| 0.8611111111111112 | 0 |
| 0.8618055555555556 | 0 |
| 0.8624999999999999 | 0 |
| 0.8631944444444444 | 0 |
| 0.8638888888888889 | 0 |
| 0.8645833333333334 | 0 |
| 0.8652777777777777 | 0 |
| 0.8659722222222223 | 0 |
| 0.8666666666666667 | 0 |
| 0.8673611111111111 | 0 |
| 0.8680555555555555 | 0 |
| 0.86875 | 0 |
| 0.8694444444444445 | 0 |
| 0.8701388888888889 | 0 |
| 0.8708333333333332 | 0 |
| 0.8715277777777778 | 0 |
| 0.8722222222222222 | 0 |
| 0.8729166666666667 | 0 |
| 0.873611111111111 | 0 |
| 0.8743055555555556 | 0 |
| 0.875 | 0 |
| 0.8756944444444444 | 0 |
| 0.876388888888889 | 0 |
| 0.8770833333333333 | 0 |
| 0.8777777777777778 | 0 |
| 0.8784722222222222 | 0 |
| 0.8791666666666668 | 0 |
| 0.8798611111111111 | 0 |
| 0.8805555555555555 | 0 |
| 0.88125 | 0 |
| 0.8819444444444445 | 0 |
| 0.8826388888888889 | 0 |
| 0.8833333333333333 | 0 |
| 0.8840277777777777 | 0 |
| 0.8847222222222223 | 0 |
| 0.8854166666666666 | 0 |
| 0.8861111111111111 | 0 |
| 0.8868055555555556 | 0 |
| 0.8875000000000001 | 0 |
| 0.8881944444444444 | 0 |
| 0.8888888888888888 | 0 |
| 0.8895833333333334 | 0 |
| 0.8902777777777778 | 0 |
| 0.8909722222222222 | 0 |
| 0.8916666666666666 | 0 |
| 0.8923611111111112 | 0 |
| 0.8930555555555556 | 0 |
| 0.8937499999999999 | 0 |
| 0.8944444444444444 | 0 |
| 0.8951388888888889 | 0 |
| 0.8958333333333334 | 0 |
| 0.8965277777777777 | 0 |
| 0.8972222222222223 | 0 |
| 0.8979166666666667 | 0 |
| 0.8986111111111111 | 0 |
| 0.8993055555555555 | 0 |
| 0.9 | 0 |
| 0.9006944444444445 | 0 |
| 0.9013888888888889 | 0 |
| 0.9020833333333332 | 0 |
| 0.9027777777777778 | 0 |
| 0.9034722222222222 | 0 |
| 0.9041666666666667 | 0 |
| 0.904861111111111 | 0 |
| 0.9055555555555556 | 0 |
| 0.90625 | 0 |
| 0.9069444444444444 | 0 |
| 0.907638888888889 | 0 |
| 0.9083333333333333 | 0 |
| 0.9090277777777778 | 0 |
| 0.9097222222222222 | 0 |
| 0.9104166666666668 | 0 |
| 0.9111111111111111 | 0 |
| 0.9118055555555555 | 0 |
| 0.9125 | 0 |
| 0.9131944444444445 | 0 |
| 0.9138888888888889 | 0 |
| 0.9145833333333333 | 0 |
| 0.9152777777777777 | 0 |
| 0.9159722222222223 | 0 |
| 0.9166666666666666 | 0 |
| 0.9173611111111111 | 0 |
| 0.9180555555555556 | 0 |
| 0.9187500000000001 | 0 |
| 0.9194444444444444 | 0 |
| 0.9201388888888888 | 0 |
| 0.9208333333333334 | 0 |
| 0.9215277777777778 | 0 |
| 0.9222222222222222 | 0 |
| 0.9229166666666666 | 0 |
| 0.9236111111111112 | 0 |
| 0.9243055555555556 | 0 |
| 0.9249999999999999 | 0 |
| 0.9256944444444444 | 0 |
| 0.9263888888888889 | 0 |
| 0.9270833333333334 | 0 |
| 0.9277777777777777 | 0 |
| 0.9284722222222223 | 0 |
| 0.9291666666666667 | 0 |
| 0.9298611111111111 | 0 |
| 0.9305555555555555 | 0 |
| 0.93125 | 0 |
| 0.9319444444444445 | 0 |
| 0.9326388888888889 | 0 |
| 0.9333333333333332 | 0 |
| 0.9340277777777778 | 0 |
| 0.9347222222222222 | 0 |
| 0.9354166666666667 | 0 |
| 0.936111111111111 | 0 |
| 0.9368055555555556 | 0 |
| 0.9375 | 0 |
| 0.9381944444444444 | 0 |
| 0.938888888888889 | 0 |
| 0.9395833333333333 | 0 |
| 0.9402777777777778 | 0 |
| 0.9409722222222222 | 0 |
| 0.9416666666666668 | 0 |
| 0.9423611111111111 | 0 |
| 0.9430555555555555 | 0 |
| 0.94375 | 0 |
| 0.9444444444444445 | 0 |
| 0.9451388888888889 | 0 |
| 0.9458333333333333 | 0 |
| 0.9465277777777777 | 0 |
| 0.9472222222222223 | 0 |
| 0.9479166666666666 | 0 |
| 0.9486111111111111 | 0 |
| 0.9493055555555556 | 0 |
| 0.9500000000000001 | 0 |
| 0.9506944444444444 | 0 |
| 0.9513888888888888 | 0 |
| 0.9520833333333334 | 0 |
| 0.9527777777777778 | 0 |
| 0.9534722222222222 | 0 |
| 0.9541666666666666 | 0 |
| 0.9548611111111112 | 0 |
| 0.9555555555555556 | 0 |
| 0.9562499999999999 | 0 |
| 0.9569444444444444 | 0 |
| 0.9576388888888889 | 0 |
| 0.9583333333333334 | 0 |
| 0.9590277777777777 | 0 |
| 0.9597222222222223 | 0 |
| 0.9604166666666667 | 0 |
| 0.9611111111111111 | 0 |
| 0.9618055555555555 | 0 |
| 0.9625 | 0 |
| 0.9631944444444445 | 0 |
| 0.9638888888888889 | 0 |
| 0.9645833333333332 | 0 |
| 0.9652777777777778 | 0 |
| 0.9659722222222222 | 0 |
| 0.9666666666666667 | 0 |
| 0.967361111111111 | 0 |
| 0.9680555555555556 | 0 |
| 0.96875 | 0 |
| 0.9694444444444444 | 0 |
| 0.970138888888889 | 0 |
| 0.9708333333333333 | 0 |
| 0.9715277777777778 | 0 |
| 0.9722222222222222 | 0 |
| 0.9729166666666668 | 0 |
| 0.9736111111111111 | 0 |
| 0.9743055555555555 | 0 |
| 0.975 | 0 |
| 0.9756944444444445 | 0 |
| 0.9763888888888889 | 0 |
| 0.9770833333333333 | 0 |
| 0.9777777777777777 | 0 |
| 0.9784722222222223 | 0 |
| 0.9791666666666666 | 0 |
| 0.9798611111111111 | 0 |
| 0.9805555555555556 | 0 |
| 0.9812500000000001 | 0 |
| 0.9819444444444444 | 0 |
| 0.9826388888888888 | 0 |
| 0.9833333333333334 | 0 |
| 0.9840277777777778 | 0 |
| 0.9847222222222222 | 0 |
| 0.9854166666666666 | 0 |
| 0.9861111111111112 | 0 |
| 0.9868055555555556 | 0 |
| 0.9874999999999999 | 0 |
| 0.9881944444444444 | 0 |
| 0.9888888888888889 | 0 |
| 0.9895833333333334 | 0 |
| 0.9902777777777777 | 0 |
| 0.9909722222222223 | 0 |
| 0.9916666666666667 | 0 |
| 0.9923611111111111 | 0 |
| 0.9930555555555555 | 0 |
| 0.99375 | 0 |
| 0.9944444444444445 | 0 |
| 0.9951388888888889 | 0 |
| 0.9958333333333332 | 0 |
| 0.9965277777777778 | 0 |
| 0.9972222222222222 | 0 |
| 0.9979166666666667 | 0 |
| 0.998611111111111 | 0 |
| 0.9993055555555556 | 0 |